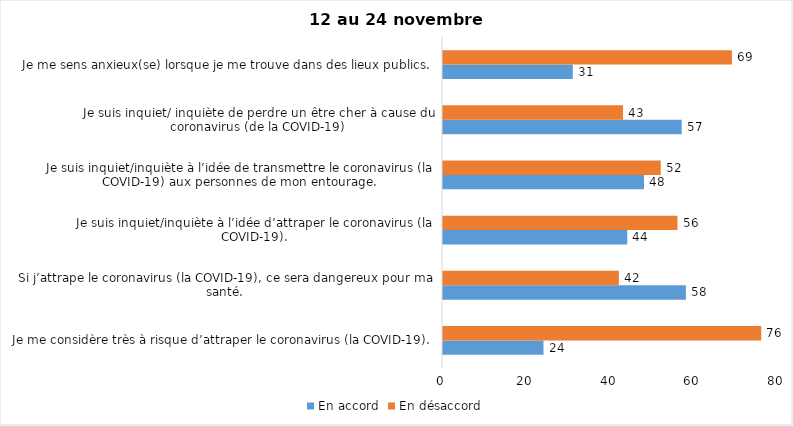
| Category | En accord | En désaccord |
|---|---|---|
| Je me considère très à risque d’attraper le coronavirus (la COVID-19). | 24 | 76 |
| Si j’attrape le coronavirus (la COVID-19), ce sera dangereux pour ma santé. | 58 | 42 |
| Je suis inquiet/inquiète à l’idée d’attraper le coronavirus (la COVID-19). | 44 | 56 |
| Je suis inquiet/inquiète à l’idée de transmettre le coronavirus (la COVID-19) aux personnes de mon entourage. | 48 | 52 |
| Je suis inquiet/ inquiète de perdre un être cher à cause du coronavirus (de la COVID-19) | 57 | 43 |
| Je me sens anxieux(se) lorsque je me trouve dans des lieux publics. | 31 | 69 |